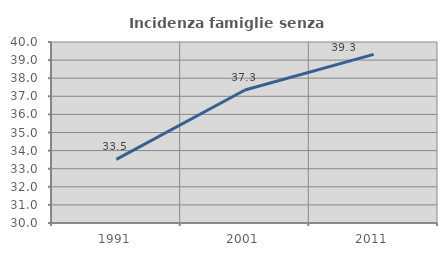
| Category | Incidenza famiglie senza nuclei |
|---|---|
| 1991.0 | 33.514 |
| 2001.0 | 37.347 |
| 2011.0 | 39.314 |